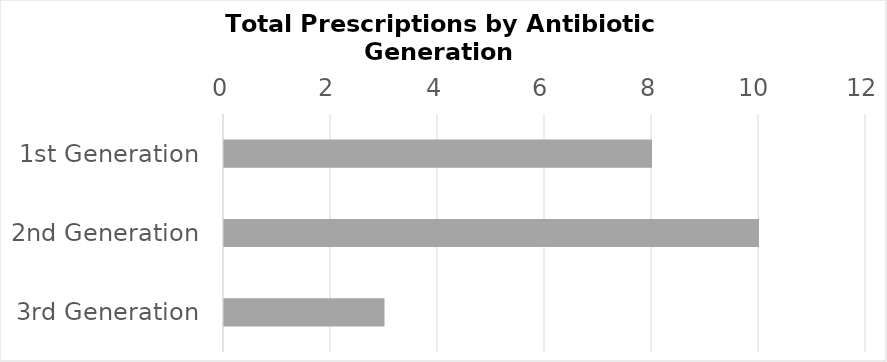
| Category | Series 0 |
|---|---|
| 1st Generation | 8 |
| 2nd Generation | 10 |
| 3rd Generation | 3 |